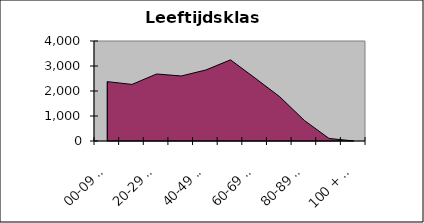
| Category | Series 1 |
|---|---|
| 00-09 JAAR | 2375 |
| 10-19 JAAR | 2263 |
| 20-29 JAAR | 2681 |
| 30-39 JAAR | 2601 |
| 40-49 JAAR | 2841 |
| 50-59 JAAR | 3246 |
| 60-69 JAAR | 2516 |
| 70-79 JAAR | 1769 |
| 80-89 JAAR | 821 |
| 90-99 JAAR | 102 |
| 100 + JAAR | 1 |